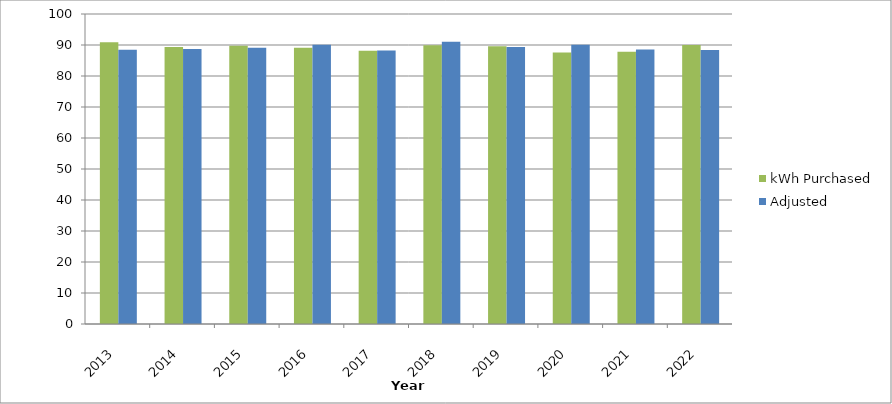
| Category | kWh Purchased | Adjusted |
|---|---|---|
| 2013.0 | 90874156.26 | 88474218.03 |
| 2014.0 | 89376615.26 | 88741305.069 |
| 2015.0 | 89768282.26 | 89116051.605 |
| 2016.0 | 89085775.26 | 90068963.594 |
| 2017.0 | 88171491.93 | 88229509.971 |
| 2018.0 | 89884663.68 | 91059144.075 |
| 2019.0 | 89565183.47 | 89389191.658 |
| 2020.0 | 87584142.184 | 90085048.36 |
| 2021.0 | 87828569.654 | 88573665.34 |
| 2022.0 | 90017844.81 | 88419627.066 |